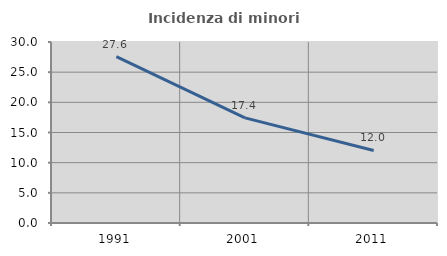
| Category | Incidenza di minori stranieri |
|---|---|
| 1991.0 | 27.586 |
| 2001.0 | 17.431 |
| 2011.0 | 12.026 |